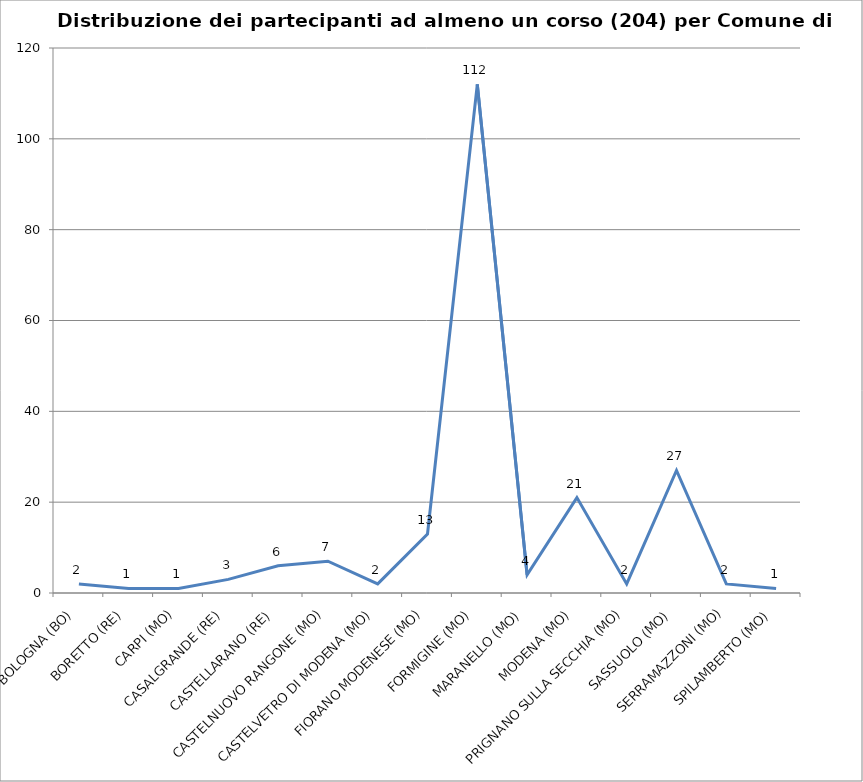
| Category | Nr. Tesserati |
|---|---|
| BOLOGNA (BO) | 2 |
| BORETTO (RE) | 1 |
| CARPI (MO) | 1 |
| CASALGRANDE (RE) | 3 |
| CASTELLARANO (RE) | 6 |
| CASTELNUOVO RANGONE (MO) | 7 |
| CASTELVETRO DI MODENA (MO) | 2 |
| FIORANO MODENESE (MO) | 13 |
| FORMIGINE (MO) | 112 |
| MARANELLO (MO) | 4 |
| MODENA (MO) | 21 |
| PRIGNANO SULLA SECCHIA (MO) | 2 |
| SASSUOLO (MO) | 27 |
| SERRAMAZZONI (MO) | 2 |
| SPILAMBERTO (MO) | 1 |